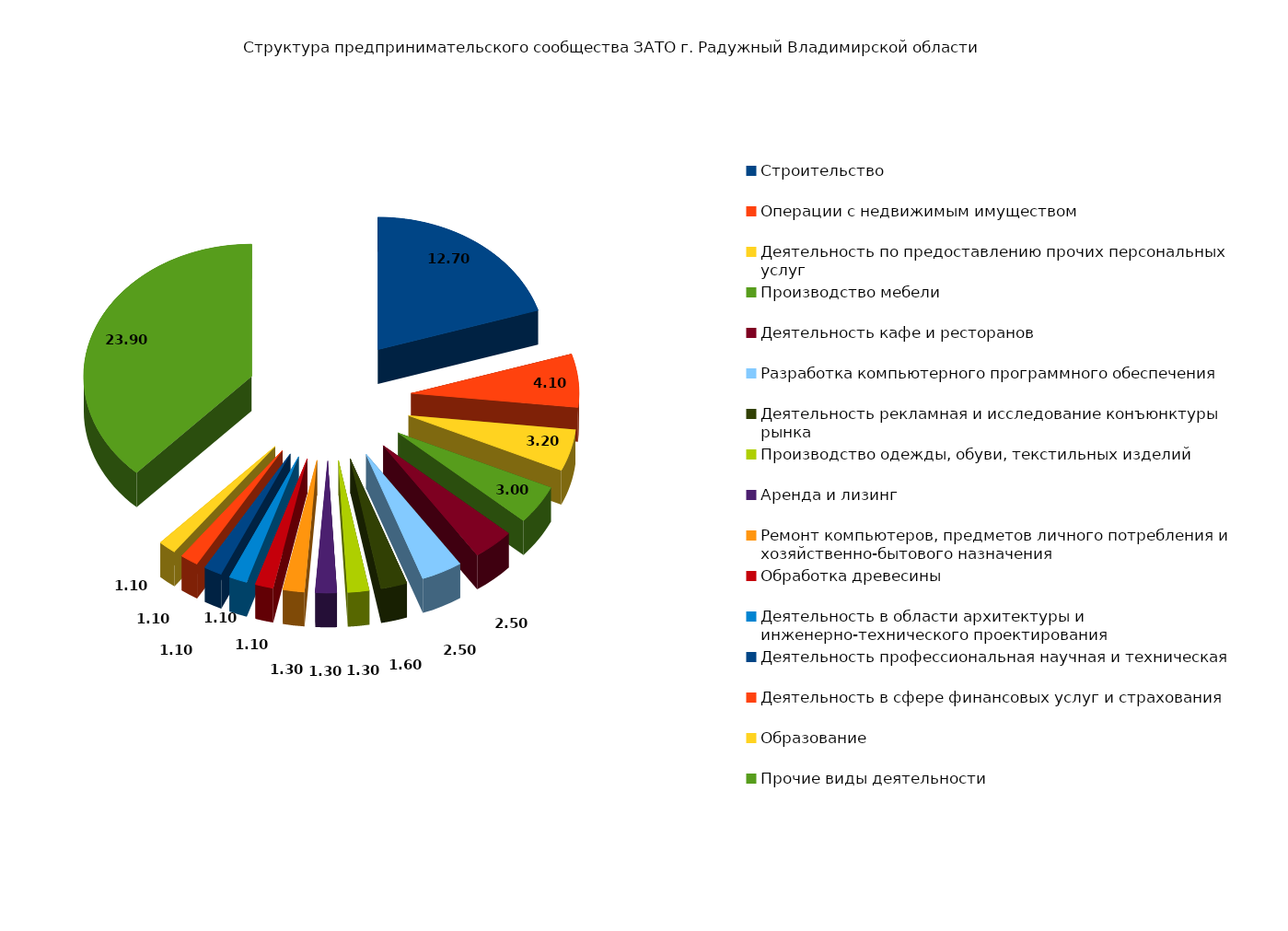
| Category | 37,10 |
|---|---|
| Строительство | 12.7 |
| Операции с недвижимым имуществом | 4.1 |
| Деятельность по предоставлению прочих персональных услуг | 3.2 |
| Производство мебели | 3 |
| Деятельность кафе и ресторанов | 2.5 |
| Разработка компьютерного программного обеспечения | 2.5 |
| Деятельность рекламная и исследование конъюнктуры рынка | 1.6 |
| Производство одежды, обуви, текстильных изделий | 1.3 |
| Аренда и лизинг | 1.3 |
| Ремонт компьютеров, предметов личного потребления и хозяйственно-бытового назначения | 1.3 |
| Обработка древесины | 1.1 |
| Деятельность в области архитектуры и инженерно-технического проектирования | 1.1 |
| Деятельность профессиональная научная и техническая | 1.1 |
| Деятельность в сфере финансовых услуг и страхования | 1.1 |
| Образование | 1.1 |
| Прочие виды деятельности | 23.9 |